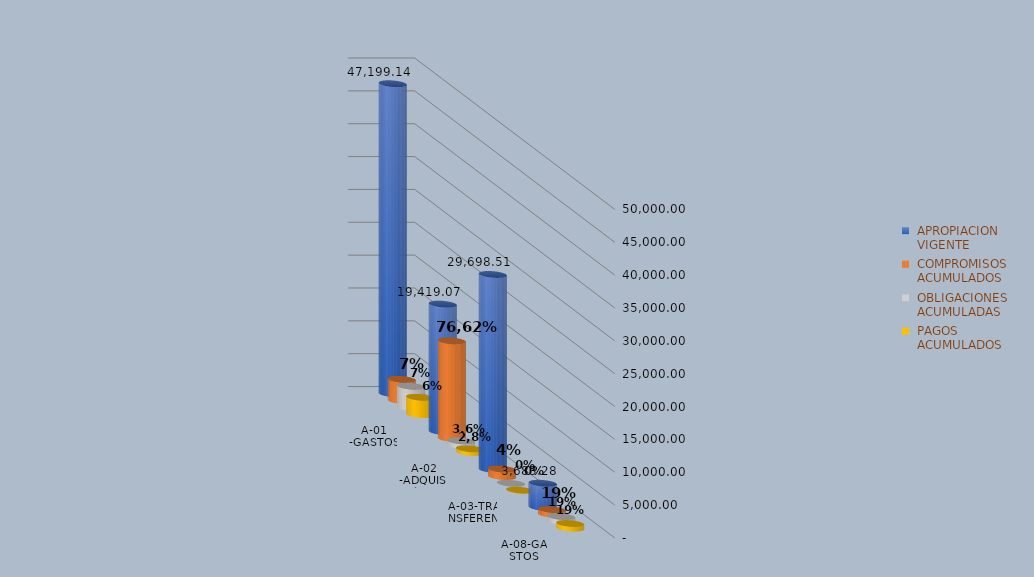
| Category |  APROPIACION
 VIGENTE |  COMPROMISOS
 ACUMULADOS |  OBLIGACIONES
 ACUMULADAS |  PAGOS
 ACUMULADOS |
|---|---|---|---|---|
| A-01 -GASTOS DE PERSONAL | 47199.142 | 3262.028 | 3262.028 | 2618.143 |
| A-02 -ADQUISICIÓN DE BIENES  Y SERVICIOS | 19419.071 | 14878.847 | 691.413 | 539.588 |
| A-03-TRANSFERENCIAS CORRIENTES | 29698.508 | 1129.74 | 8.7 | 8.7 |
| A-08-GASTOS POR TRIBUTOS, MULTAS, SANCIONES E INTERESES DE MORA | 3683.28 | 702.488 | 702.488 | 702.488 |